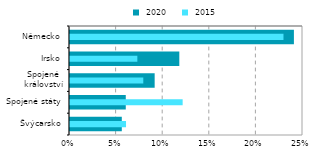
| Category |  2020 |
|---|---|
| Švýcarsko | 0.056 |
| Spojené státy | 0.06 |
| Spojené
království | 0.091 |
| Irsko | 0.117 |
| Německo | 0.24 |